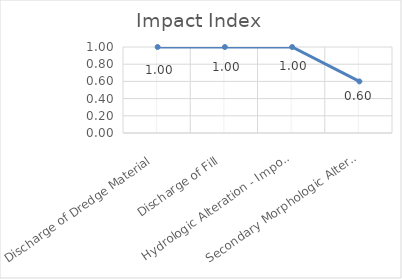
| Category | Impact Index |
|---|---|
| Discharge of Dredge Material | 1 |
| Discharge of Fill | 1 |
| Hydrologic Alteration - Impound | 1 |
| Secondary Morphologic Alteration | 0.6 |